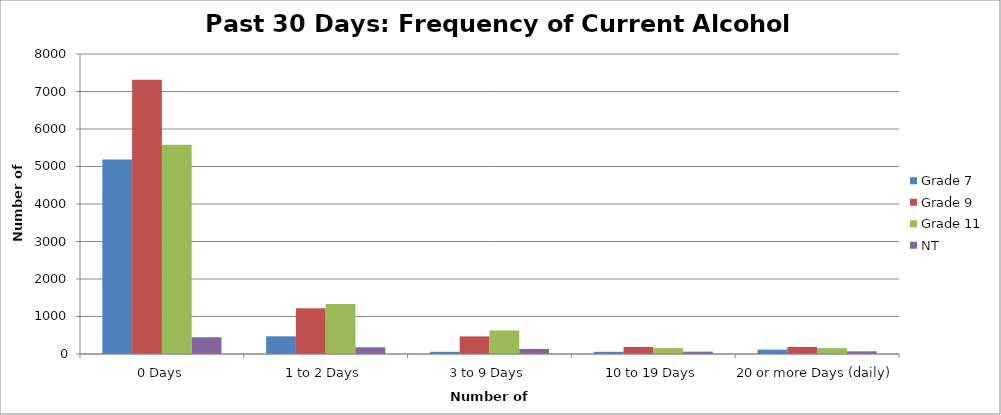
| Category | Grade 7 | Grade 9 | Grade 11 | NT |
|---|---|---|---|---|
| 0 Days | 5185.84 | 7315.62 | 5578.47 | 446.5 |
| 1 to 2 Days | 471.44 | 1219.27 | 1335.69 | 178.6 |
| 3 to 9 Days | 58.93 | 468.95 | 628.56 | 133.95 |
| 10 to 19 Days | 58.93 | 187.58 | 157.14 | 62.51 |
| 20 or more Days (daily) | 117.86 | 187.58 | 157.14 | 71.44 |